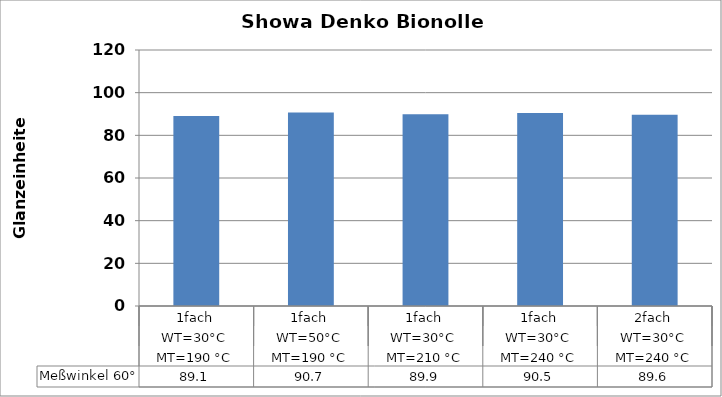
| Category | Meßwinkel 60° |
|---|---|
| 0 | 89.1 |
| 1 | 90.7 |
| 2 | 89.9 |
| 3 | 90.5 |
| 4 | 89.6 |